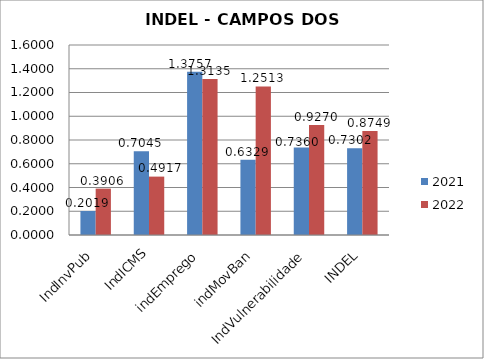
| Category | 2021 | 2022 |
|---|---|---|
| IndInvPub | 0.202 | 0.391 |
| IndICMS | 0.704 | 0.492 |
| indEmprego | 1.376 | 1.314 |
| indMovBan | 0.633 | 1.251 |
| IndVulnerabilidade | 0.736 | 0.927 |
| INDEL | 0.73 | 0.875 |